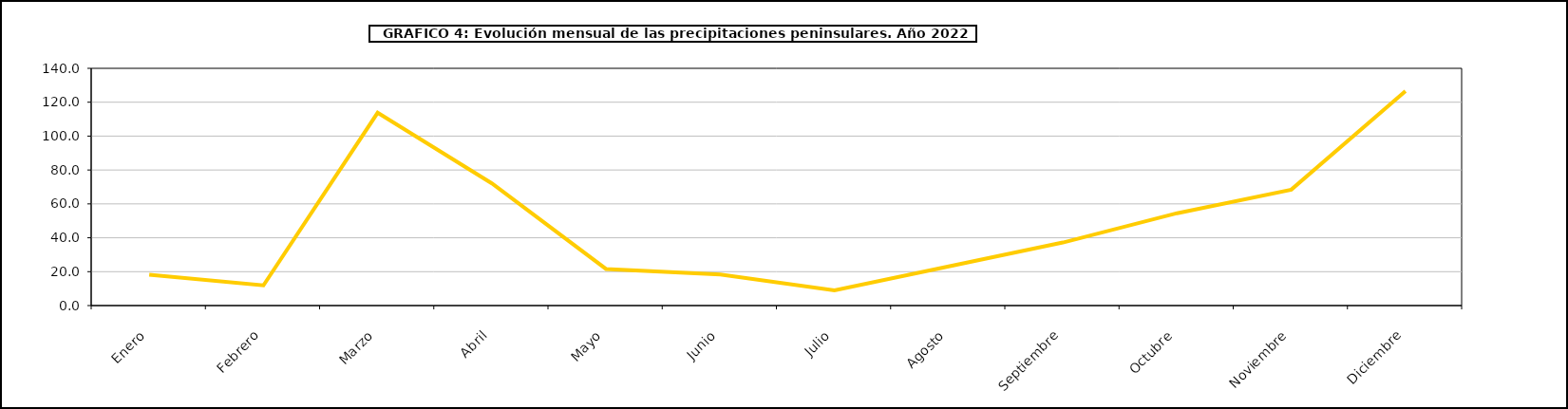
| Category | peninsula |
|---|---|
| 0 | 18.2 |
| 1 | 11.9 |
| 2 | 113.8 |
| 3 | 72.1 |
| 4 | 21.6 |
| 5 | 18.3 |
| 6 | 9 |
| 7 | 23.1 |
| 8 | 37.2 |
| 9 | 54.5 |
| 10 | 68.4 |
| 11 | 126.6 |